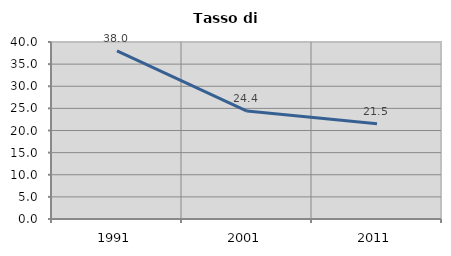
| Category | Tasso di disoccupazione   |
|---|---|
| 1991.0 | 38 |
| 2001.0 | 24.38 |
| 2011.0 | 21.525 |